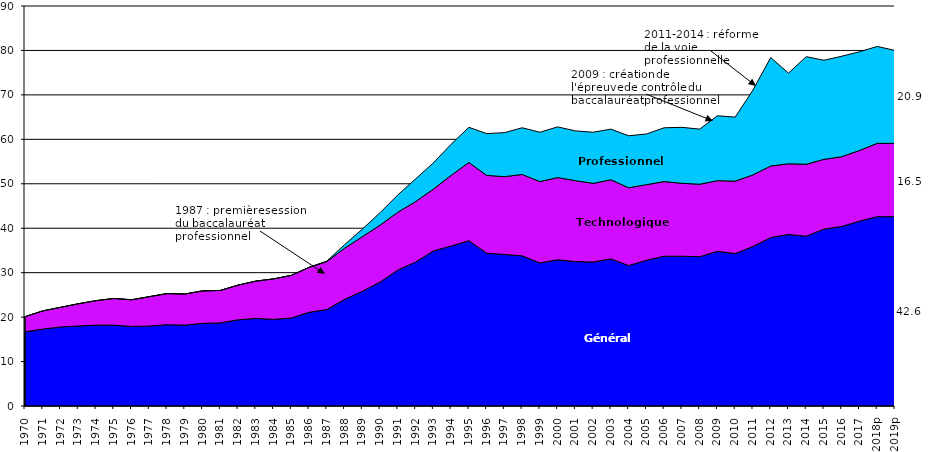
| Category | Series 0 | Series 1 | Series 2 |
|---|---|---|---|
| 1970 | 16.7 | 3.4 | 0 |
| 1971 | 17.3 | 4.1 | 0 |
| 1972 | 17.8 | 4.4 | 0 |
| 1973 | 18 | 5 | 0 |
| 1974 | 18.2 | 5.5 | 0 |
| 1975 | 18.2 | 6 | 0 |
| 1976 | 17.9 | 6 | 0 |
| 1977 | 18 | 6.6 | 0 |
| 1978 | 18.3 | 7 | 0 |
| 1979 | 18.2 | 7 | 0 |
| 1980 | 18.6 | 7.3 | 0 |
| 1981 | 18.7 | 7.3 | 0 |
| 1982 | 19.4 | 7.8 | 0 |
| 1983 | 19.7 | 8.4 | 0 |
| 1984 | 19.5 | 9.1 | 0 |
| 1985 | 19.8 | 9.6 | 0 |
| 1986 | 21.1 | 10.1 | 0 |
| 1987 | 21.7 | 10.8 | 0.1 |
| 1988 | 24 | 11.5 | 0.8 |
| 1989 | 25.8 | 12.3 | 1.7 |
| 1990 | 27.9 | 12.8 | 2.8 |
| 1991 | 30.6 | 13 | 3.9 |
| 1992 | 32.4 | 13.6 | 5.1 |
| 1993 | 34.9 | 13.9 | 5.9 |
| 1994 | 36 | 15.9 | 7 |
| 1995 | 37.2 | 17.6 | 7.9 |
| 1996 | 34.4 | 17.5 | 9.4 |
| 1997 | 34.1 | 17.5 | 9.9 |
| 1998 | 33.8 | 18.3 | 10.5 |
| 1999 | 32.2 | 18.3 | 11.1 |
| 2000 | 32.9 | 18.5 | 11.4 |
| 2001 | 32.5 | 18.2 | 11.2 |
| 2002 | 32.4 | 17.7 | 11.5 |
| 2003 | 33.1 | 17.8 | 11.4 |
| 2004 | 31.6 | 17.5 | 11.7 |
| 2005 | 32.8 | 17 | 11.4 |
| 2006 | 33.7 | 16.8 | 12.1 |
| 2007 | 33.7 | 16.4 | 12.6 |
| 2008 | 33.6 | 16.3 | 12.4 |
| 2009 | 34.8 | 15.9 | 14.6 |
| 2010 | 34.3 | 16.3 | 14.4 |
| 2011 | 35.9 | 16.1 | 19.1 |
| 2012 | 37.9 | 16.1 | 24.4 |
| 2013 | 38.6 | 15.9 | 20.4 |
| 2014 | 38.2 | 16.2 | 24.2 |
| 2015 | 39.8 | 15.7 | 22.3 |
| 2016 | 40.4 | 15.7 | 22.6 |
| 2017 | 41.6 | 15.9 | 22.2 |
| 2018p | 42.6 | 16.5 | 21.8 |
| 2019p | 42.6 | 16.5 | 20.9 |